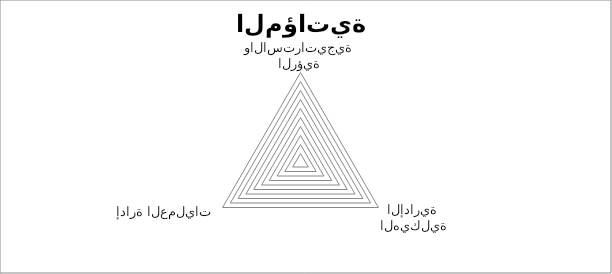
| Category | Series 0 |
|---|---|
| الرؤية والاستراتيجية | 0 |
| الهيكلية الإدارية  | 0 |
| إدارة العمليات  | 0 |